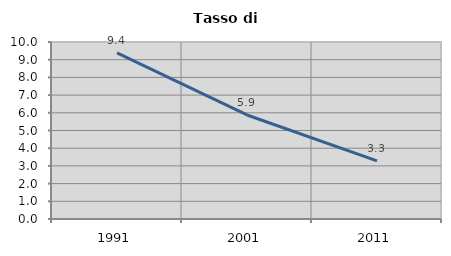
| Category | Tasso di disoccupazione   |
|---|---|
| 1991.0 | 9.38 |
| 2001.0 | 5.878 |
| 2011.0 | 3.286 |